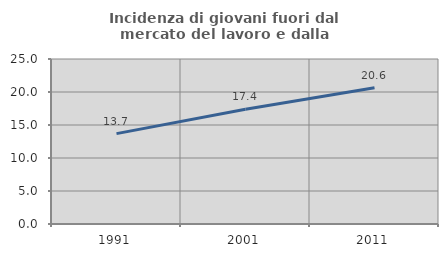
| Category | Incidenza di giovani fuori dal mercato del lavoro e dalla formazione  |
|---|---|
| 1991.0 | 13.694 |
| 2001.0 | 17.374 |
| 2011.0 | 20.631 |